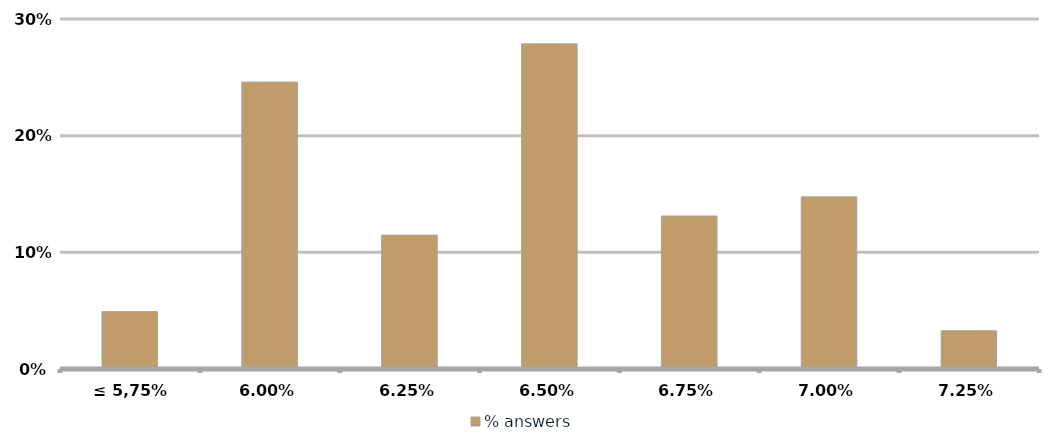
| Category | % answers |
|---|---|
| ≤ 5,75% | 0.049 |
| 6,00% | 0.246 |
| 6,25% | 0.115 |
| 6,50% | 0.279 |
| 6,75% | 0.131 |
| 7,00% | 0.148 |
| 7,25% | 0.033 |